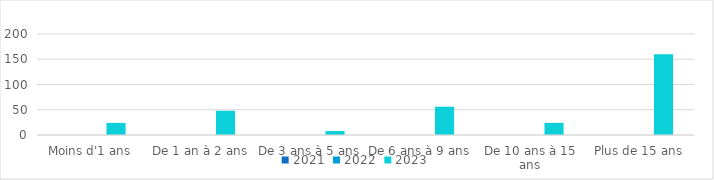
| Category | 2021 | 2022 | 2023 |
|---|---|---|---|
| Moins d'1 ans | 0 | 0 | 24 |
| De 1 an à 2 ans | 0 | 0 | 48 |
| De 3 ans à 5 ans | 0 | 0 | 8 |
| De 6 ans à 9 ans | 0 | 0 | 56 |
| De 10 ans à 15 ans | 0 | 0 | 24 |
| Plus de 15 ans | 0 | 0 | 160 |